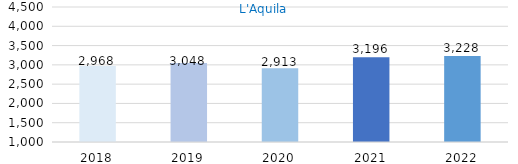
| Category | Series 0 |
|---|---|
| 2018.0 | 2968 |
| 2019.0 | 3048 |
| 2020.0 | 2913 |
| 2021.0 | 3196 |
| 2022.0 | 3228 |